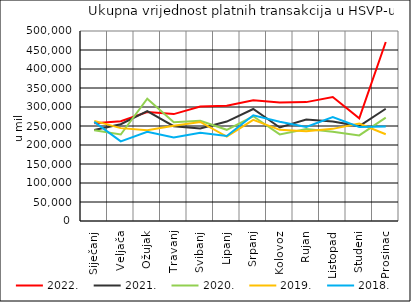
| Category | 2022. | 2021. | 2020. | 2019. | 2018. |
|---|---|---|---|---|---|
| Siječanj | 257301.045 | 239737.072 | 238791.39 | 263579.124 | 260982.574 |
| Veljača | 262611.606 | 254737.007 | 227555.463 | 244414.145 | 209434.706 |
| Ožujak | 286535.336 | 289434.699 | 321959.709 | 238999.827 | 234774.619 |
| Travanj | 281318.148 | 249545.188 | 259638.022 | 250874.591 | 219520.498 |
| Svibanj | 301132.917 | 243297.103 | 263506.422 | 260536.495 | 232314.994 |
| Lipanj | 303566.428 | 261740.299 | 240013.078 | 222265.468 | 223508.365 |
| Srpanj | 317553.864 | 294783.843 | 275562.72 | 265953.941 | 278130.033 |
| Kolovoz | 311890.505 | 246102.244 | 227970.798 | 239889.373 | 261384.496 |
| Rujan | 312858.852 | 267078.842 | 242209.109 | 236199.197 | 247615.282 |
| Listopad | 326381.503 | 261859.425 | 234651.085 | 242449.519 | 273283.323 |
| Studeni | 270483.669 | 249717.675 | 225226.454 | 256441.574 | 247537.617 |
| Prosinac | 471010.315 | 295438.856 | 272001.5 | 228160.913 | 248820.584 |